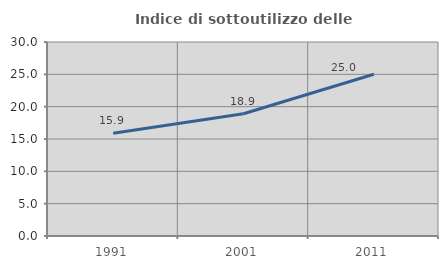
| Category | Indice di sottoutilizzo delle abitazioni  |
|---|---|
| 1991.0 | 15.89 |
| 2001.0 | 18.898 |
| 2011.0 | 25.02 |